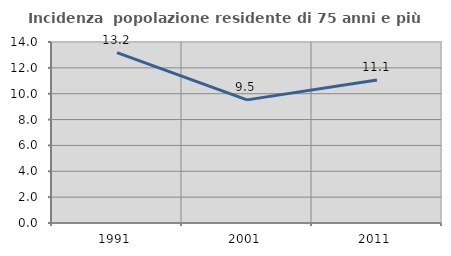
| Category | Incidenza  popolazione residente di 75 anni e più |
|---|---|
| 1991.0 | 13.18 |
| 2001.0 | 9.524 |
| 2011.0 | 11.054 |